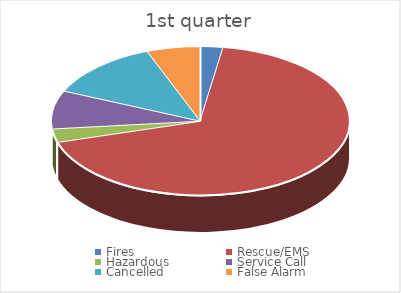
| Category | 1st quarter | 2017 |
|---|---|---|
| Fires | 29 |  |
| Rescue/EMS | 798 |  |
| Hazardous | 35 |  |
| Service Call | 97 |  |
| Cancelled  | 148 |  |
| False Alarm | 68 |  |